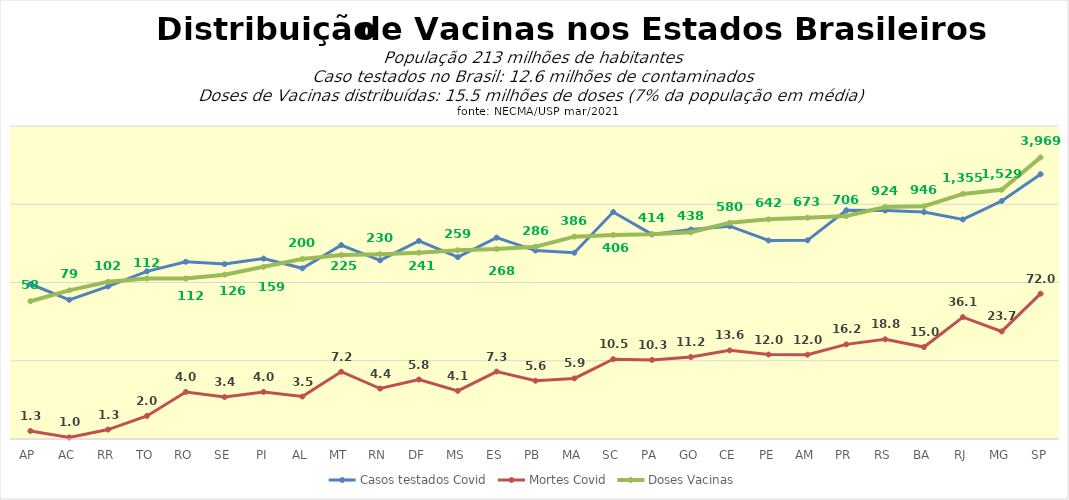
| Category | Casos testados Covid | Mortes Covid | Doses Vacinas |
|---|---|---|---|
| AP | 95.649 | 1.268 | 57.6 |
| AC | 60.069 | 1.047 | 79.36 |
| RR | 89.116 | 1.32 | 102.02 |
| TO | 139 | 1.972 | 112.4 |
| RO | 184 | 3.99 | 112.408 |
| SE | 172 | 3.432 | 125.98 |
| PI | 202 | 3.996 | 158.88 |
| AL | 152 | 3.489 | 200.06 |
| MT | 300 | 7.241 | 224.56 |
| RN | 192 | 4.413 | 230.24 |
| DF | 340 | 5.757 | 240.56 |
| MS | 211 | 4.123 | 258.66 |
| ES | 374 | 7.278 | 268.42 |
| PB | 256 | 5.552 | 286.42 |
| MA | 240 | 5.949 | 385.64 |
| SC | 795 | 10.482 | 405.84 |
| PA | 412 | 10.252 | 414.04 |
| GO | 475 | 11.16 | 438.48 |
| CE | 524 | 13.58 | 579.6 |
| PE | 344 | 12.006 | 641.56 |
| AM | 346 | 11.952 | 672.62 |
| PR | 837 | 16.19 | 706.2 |
| RS | 831 | 18.826 | 923.6 |
| BA | 794 | 14.96 | 945.6 |
| RJ | 640 | 36.109 | 1355.33 |
| MG | 1100 | 23.687 | 1528.58 |
| SP | 2420 | 71.991 | 3969.228 |